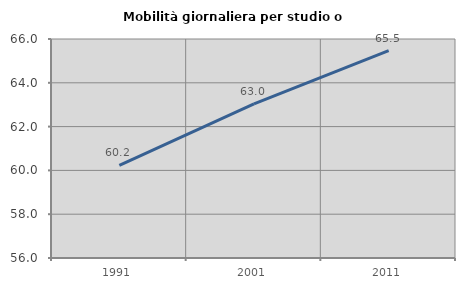
| Category | Mobilità giornaliera per studio o lavoro |
|---|---|
| 1991.0 | 60.232 |
| 2001.0 | 63.035 |
| 2011.0 | 65.471 |